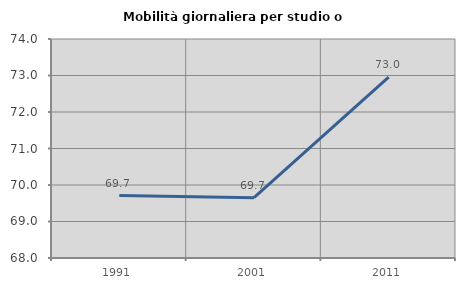
| Category | Mobilità giornaliera per studio o lavoro |
|---|---|
| 1991.0 | 69.709 |
| 2001.0 | 69.652 |
| 2011.0 | 72.954 |